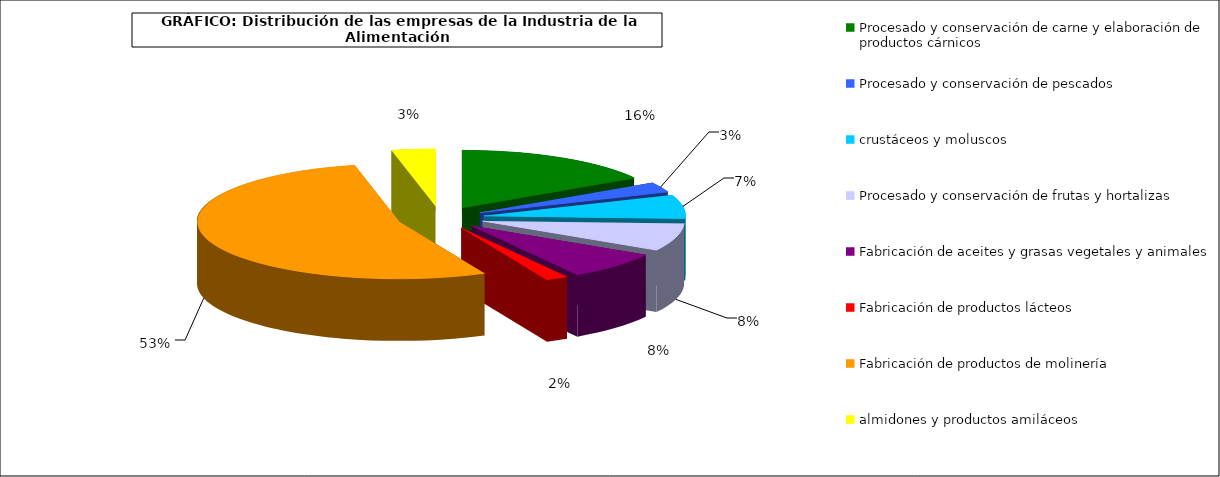
| Category | Procesado y conservación de carne y elaboración de productos cárnicos |
|---|---|
| 0 | 3554 |
| 1 | 610 |
| 2 | 1452 |
| 3 | 1689 |
| 4 | 1695 |
| 5 | 389 |
| 6 | 11676 |
| 7 | 764 |